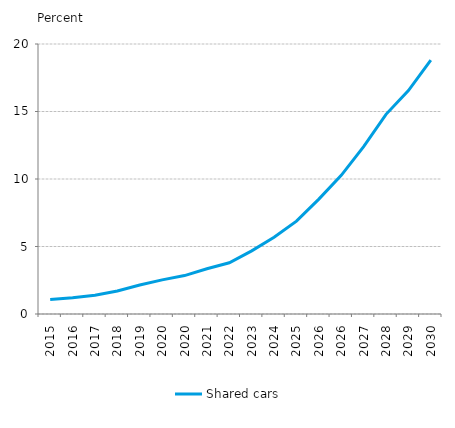
| Category | Shared cars |
|---|---|
| 2015.0 | 1.069 |
| 2016.0 | 1.197 |
| 2017.0 | 1.389 |
| 2018.0 | 1.706 |
| 2019.0 | 2.149 |
| 2020.0 | 2.529 |
| 2020.0 | 2.846 |
| 2021.0 | 3.351 |
| 2022.0 | 3.794 |
| 2023.0 | 4.675 |
| 2024.0 | 5.682 |
| 2025.0 | 6.877 |
| 2026.0 | 8.511 |
| 2026.0 | 10.269 |
| 2027.0 | 12.404 |
| 2028.0 | 14.79 |
| 2029.0 | 16.548 |
| 2030.0 | 18.808 |